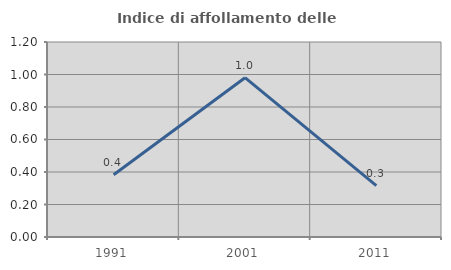
| Category | Indice di affollamento delle abitazioni  |
|---|---|
| 1991.0 | 0.383 |
| 2001.0 | 0.98 |
| 2011.0 | 0.316 |